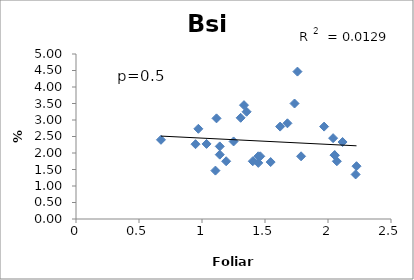
| Category | Bsi wt%_avg |
|---|---|
| 1.1064570616467035 | 1.467 |
| 1.1917796915858534 | 1.75 |
| 1.3332628765720682 | 3.45 |
| 0.948605722017827 | 2.267 |
| 1.4467796965937612 | 1.7 |
| 1.5448607331175146 | 1.725 |
| 2.219332813263847 | 1.35 |
| 2.2262384464556524 | 1.6 |
| 2.0405173370518055 | 2.45 |
| 2.1156812865987913 | 2.333 |
| 2.0702229802511773 | 1.75 |
| 1.03612545465651 | 2.275 |
| 1.734290540674994 | 3.5 |
| 1.786225042722429 | 1.9 |
| 2.053872489274724 | 1.933 |
| 1.6781243762596252 | 2.9 |
| 1.9692212294132405 | 2.8 |
| 1.1151180195191746 | 3.05 |
| 1.3540298473338095 | 3.25 |
| 1.1410481623390831 | 2.2 |
| 1.757452284422504 | 4.467 |
| 1.306931649239572 | 3.067 |
| 1.620124454512742 | 2.8 |
| 2.0526119804365006 | 1.933 |
| 1.4027898441483688 | 1.75 |
| 1.462503527743694 | 1.9 |
| 1.141003131184053 | 1.95 |
| 1.2506290534732045 | 2.35 |
| 0.6743274426989039 | 2.4 |
| 1.4466644158094875 | 1.9 |
| 0.9710005710046079 | 2.733 |